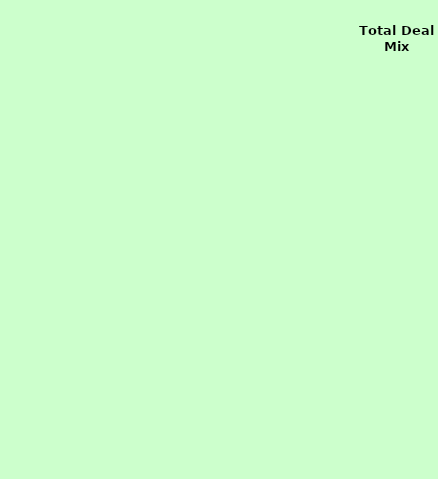
| Category | Store Deal Mix |
|---|---|
| NewCar | 0 |
| NewTruck | 0 |
| UsedCar | 0 |
| UsedTruck | 0 |
| Misc | 0 |